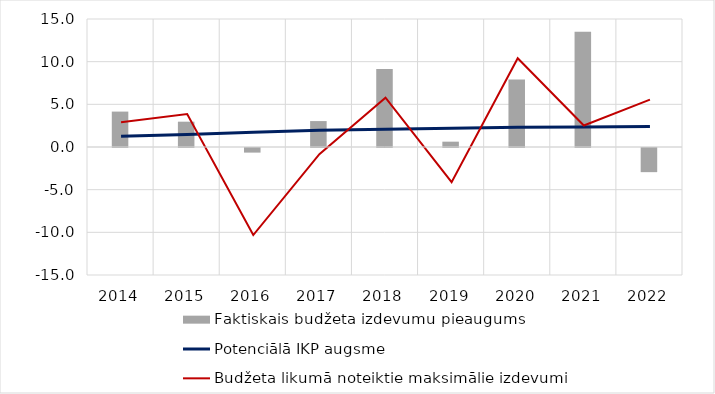
| Category | Faktiskais budžeta izdevumu pieaugums |
|---|---|
| 2014.0 | 4.149 |
| 2015.0 | 2.965 |
| 2016.0 | -0.54 |
| 2017.0 | 3.039 |
| 2018.0 | 9.134 |
| 2019.0 | 0.624 |
| 2020.0 | 7.924 |
| 2021.0 | 13.506 |
| 2022.0 | -2.83 |